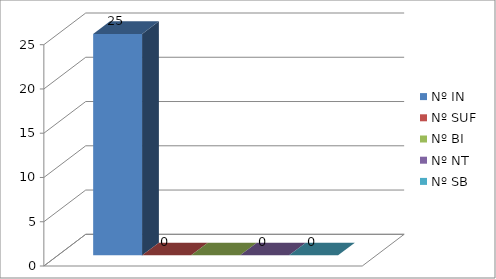
| Category | Nº IN | Nº SUF | Nº BI | Nº NT | Nº SB |
|---|---|---|---|---|---|
| 0 | 25 | 0 | 0 | 0 | 0 |